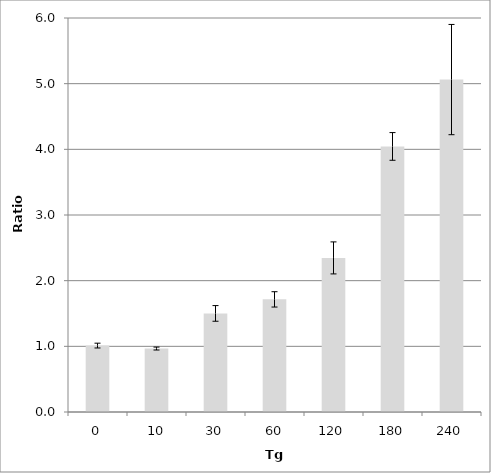
| Category | Series 0 |
|---|---|
| 0.0 | 1.011 |
| 10.0 | 0.966 |
| 30.0 | 1.501 |
| 60.0 | 1.715 |
| 120.0 | 2.347 |
| 180.0 | 4.044 |
| 240.0 | 5.062 |